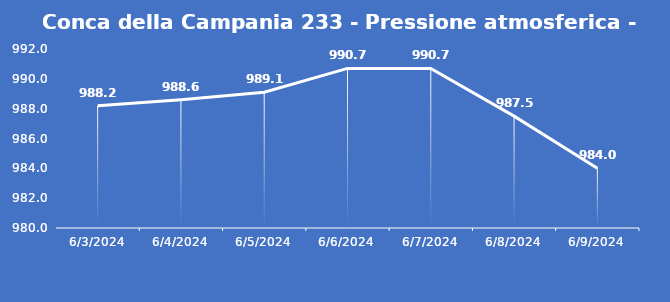
| Category | Conca della Campania 233 - Pressione atmosferica - Grezzo (hPa) |
|---|---|
| 6/3/24 | 988.2 |
| 6/4/24 | 988.6 |
| 6/5/24 | 989.1 |
| 6/6/24 | 990.7 |
| 6/7/24 | 990.7 |
| 6/8/24 | 987.5 |
| 6/9/24 | 984 |